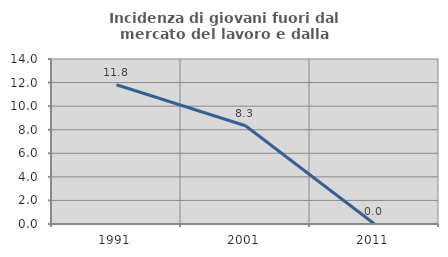
| Category | Incidenza di giovani fuori dal mercato del lavoro e dalla formazione  |
|---|---|
| 1991.0 | 11.818 |
| 2001.0 | 8.333 |
| 2011.0 | 0 |